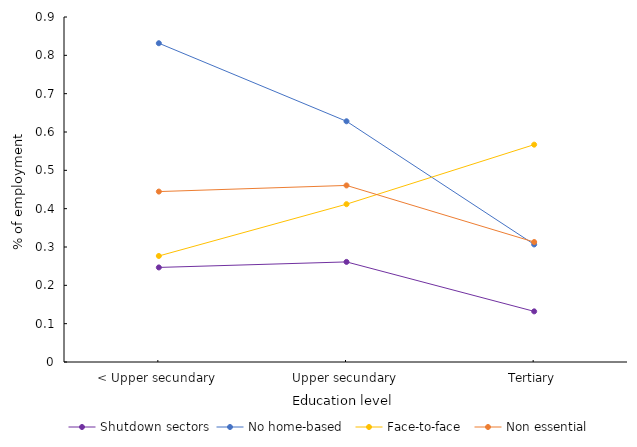
| Category | Shutdown sectors | No home-based  | Face-to-face  | Non essential |
|---|---|---|---|---|
| < Upper secundary | 0.247 | 0.832 | 0.277 | 0.445 |
| Upper secundary | 0.261 | 0.628 | 0.412 | 0.461 |
| Tertiary | 0.132 | 0.307 | 0.567 | 0.313 |